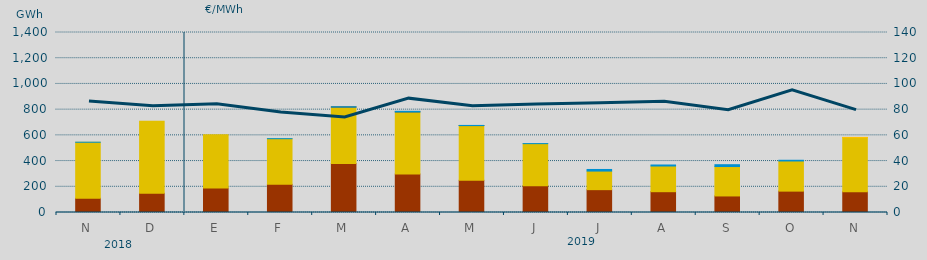
| Category | Carbón | Ciclo Combinado | Consumo Bombeo | Hidráulica | Otras Renovables |
|---|---|---|---|---|---|
| N | 110342 | 436088.1 | 0 | 152 | 0 |
| D | 149326 | 561113.3 | 0 | 0 | 0 |
| E | 190959 | 413339.8 | 0 | 0 | 0 |
| F | 219079.1 | 354875.6 | 0 | 360 | 0 |
| M | 380779.9 | 439376.7 | 792 | 709.4 | 0 |
| A | 299645.9 | 482984.6 | 52 | 4315.4 | 0 |
| M | 250250 | 425915 | 190 | 880 | 0 |
| J | 209003 | 326625.6 | 0 | 334.5 | 0 |
| J | 177655 | 144531.3 | 0 | 12515 | 0 |
| A | 161808 | 199805.1 | 0 | 7890 | 0 |
| S | 128712 | 228795.2 | 0 | 14281 | 0 |
| O | 166180 | 234526.2 | 0 | 5517.1 | 0 |
| N | 161365 | 421030.7 | 0 | 0 | 1775.2 |